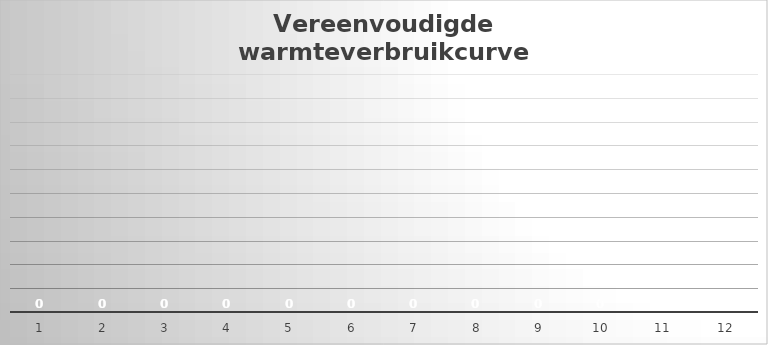
| Category | Totale warmtevraag |
|---|---|
| 0 | 0 |
| 1 | 0 |
| 2 | 0 |
| 3 | 0 |
| 4 | 0 |
| 5 | 0 |
| 6 | 0 |
| 7 | 0 |
| 8 | 0 |
| 9 | 0 |
| 10 | 0 |
| 11 | 0 |